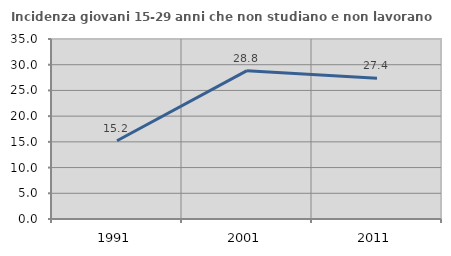
| Category | Incidenza giovani 15-29 anni che non studiano e non lavorano  |
|---|---|
| 1991.0 | 15.207 |
| 2001.0 | 28.844 |
| 2011.0 | 27.389 |